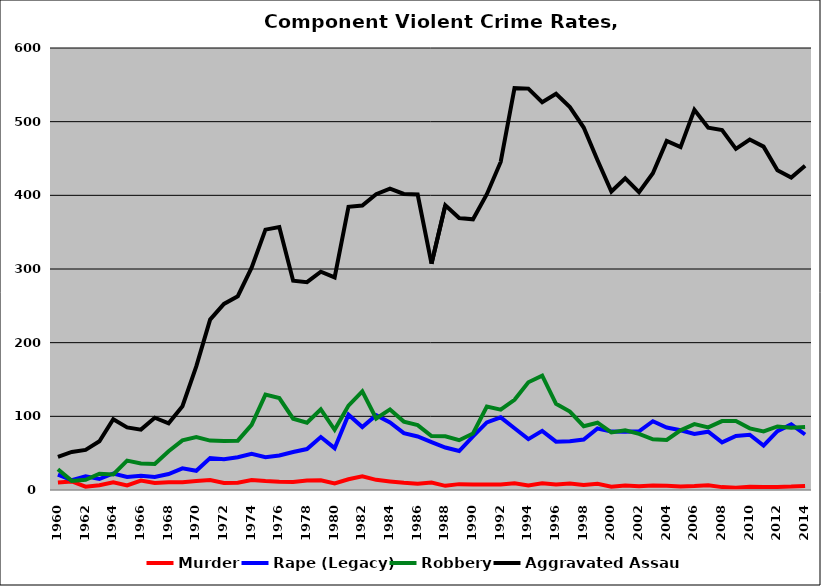
| Category | Murder | Rape (Legacy) | Robbery | Aggravated Assault |
|---|---|---|---|---|
| 1960.0 | 10.169 | 20.781 | 28.298 | 45.099 |
| 1961.0 | 11.538 | 13.248 | 12.393 | 51.709 |
| 1962.0 | 4.472 | 18.699 | 13.821 | 54.472 |
| 1963.0 | 6.452 | 14.919 | 22.177 | 66.129 |
| 1964.0 | 10.4 | 22.4 | 21.2 | 96 |
| 1965.0 | 6.324 | 17.787 | 39.921 | 84.98 |
| 1966.0 | 12.868 | 19.485 | 36.029 | 81.985 |
| 1967.0 | 9.559 | 17.647 | 35.294 | 98.162 |
| 1968.0 | 10.469 | 21.661 | 52.708 | 90.614 |
| 1969.0 | 10.638 | 29.433 | 67.376 | 113.83 |
| 1970.0 | 12.245 | 26.144 | 71.813 | 167.785 |
| 1971.0 | 13.419 | 43.45 | 67.093 | 231.31 |
| 1972.0 | 9.538 | 41.846 | 66.462 | 252.615 |
| 1973.0 | 10 | 44.545 | 66.97 | 263.03 |
| 1974.0 | 13.65 | 49.258 | 88.427 | 301.78 |
| 1975.0 | 12.216 | 44.602 | 129.545 | 353.409 |
| 1976.0 | 11.257 | 46.859 | 124.869 | 357.068 |
| 1977.0 | 10.811 | 51.597 | 96.806 | 284.029 |
| 1978.0 | 12.903 | 55.583 | 91.315 | 282.134 |
| 1979.0 | 13.3 | 71.921 | 109.606 | 296.305 |
| 1980.0 | 8.861 | 56.8 | 81.792 | 288.543 |
| 1981.0 | 14.563 | 102.184 | 114.563 | 384.466 |
| 1982.0 | 18.493 | 85.388 | 133.79 | 386.073 |
| 1983.0 | 13.779 | 101.461 | 97.077 | 401.461 |
| 1984.0 | 11.6 | 91.6 | 109.4 | 409 |
| 1985.0 | 9.789 | 77.159 | 92.898 | 401.919 |
| 1986.0 | 8.614 | 72.659 | 88.015 | 401.124 |
| 1987.0 | 10.095 | 64.952 | 73.143 | 307.238 |
| 1988.0 | 5.653 | 57.7 | 72.904 | 386.55 |
| 1989.0 | 7.97 | 52.941 | 67.552 | 369.26 |
| 1990.0 | 7.454 | 72.903 | 76.721 | 367.426 |
| 1991.0 | 7.368 | 91.754 | 113.158 | 401.579 |
| 1992.0 | 7.496 | 98.637 | 109.029 | 445.315 |
| 1993.0 | 9.015 | 83.806 | 122.371 | 545.576 |
| 1994.0 | 6.271 | 68.977 | 146.205 | 544.884 |
| 1995.0 | 9.106 | 80.298 | 155.132 | 526.325 |
| 1996.0 | 7.414 | 65.568 | 116.969 | 537.727 |
| 1997.0 | 8.867 | 66.174 | 106.404 | 519.704 |
| 1998.0 | 6.678 | 68.567 | 86.645 | 492.02 |
| 1999.0 | 8.394 | 83.454 | 91.364 | 447.619 |
| 2000.0 | 4.307 | 79.275 | 78.158 | 405.148 |
| 2001.0 | 6.155 | 79.068 | 81.12 | 423.118 |
| 2002.0 | 5.144 | 79.659 | 76.23 | 404.376 |
| 2003.0 | 6.016 | 93.324 | 68.797 | 429.907 |
| 2004.0 | 5.625 | 84.834 | 67.958 | 473.885 |
| 2005.0 | 4.825 | 81.115 | 80.965 | 465.433 |
| 2006.0 | 5.373 | 75.964 | 89.396 | 516.079 |
| 2007.0 | 6.438 | 79.154 | 85.006 | 491.75 |
| 2008.0 | 3.924 | 64.668 | 93.588 | 488.719 |
| 2009.0 | 3.15 | 73.446 | 93.633 | 463.153 |
| 2010.0 | 4.365 | 75.046 | 83.635 | 475.761 |
| 2011.0 | 4.144 | 60.233 | 79.573 | 466.112 |
| 2012.0 | 4.108 | 79.829 | 86.265 | 433.927 |
| 2013.0 | 4.612 | 89.114 | 84.502 | 424.139 |
| 2014.0 | 5.565 | 75.333 | 85.377 | 440.187 |